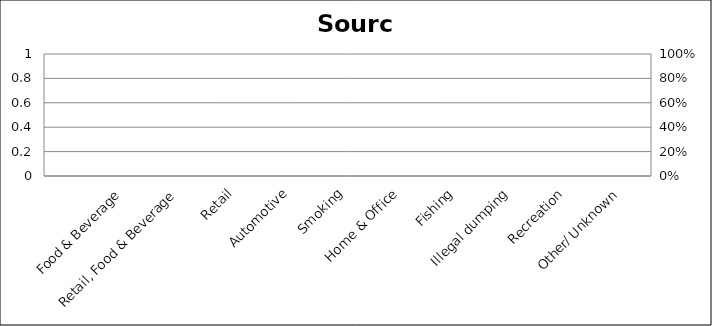
| Category | Packaging or Product Sum |
|---|---|
| Packaging | 0 |
| Service Ware | 0 |
| Product | 0 |
| Unknown | 0 |